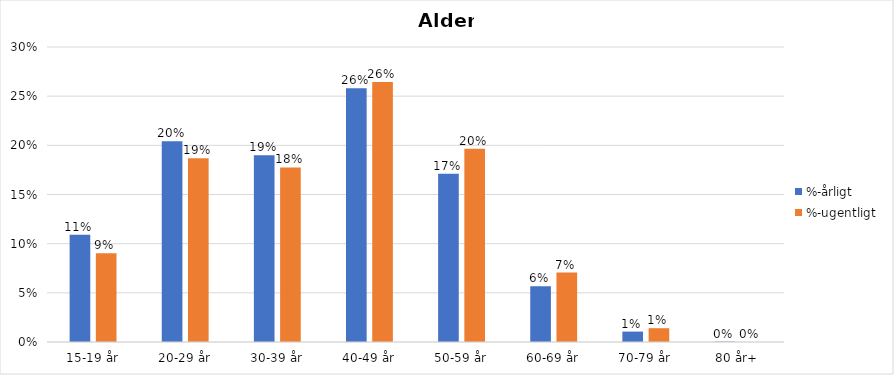
| Category | %-årligt | %-ugentligt |
|---|---|---|
| 15-19 år | 0.109 | 0.09 |
| 20-29 år | 0.204 | 0.187 |
| 30-39 år | 0.19 | 0.178 |
| 40-49 år | 0.258 | 0.264 |
| 50-59 år | 0.171 | 0.196 |
| 60-69 år | 0.057 | 0.071 |
| 70-79 år | 0.011 | 0.014 |
| 80 år+ | 0 | 0 |